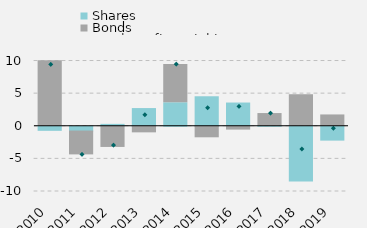
| Category | Shares | Bonds |
|---|---|---|
| 0 | -622 | 10025.487 |
| 1 | -733 | -3655.077 |
| 2 | 290 | -3248.023 |
| 3 | 2712 | -1009.67 |
| 4 | 3600 | 5855.29 |
| 5 | 4521 | -1767.135 |
| 6 | 3560 | -588.313 |
| 7 | -3 | 1948.41 |
| 8 | -8380 | 4833 |
| 9 | -2124 | 1735.314 |